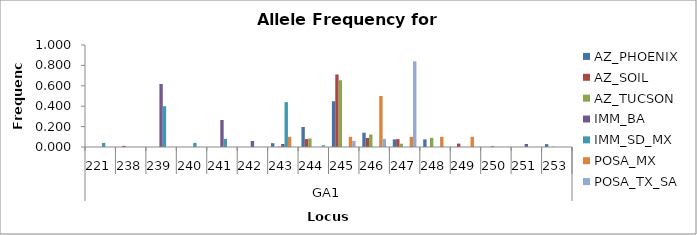
| Category | AZ_PHOENIX | AZ_SOIL | AZ_TUCSON | IMM_BA | IMM_SD_MX | POSA_MX | POSA_TX_SA |
|---|---|---|---|---|---|---|---|
| 0 | 0 | 0 | 0 | 0 | 0.04 | 0 | 0 |
| 1 | 0 | 0.011 | 0 | 0 | 0 | 0 | 0 |
| 2 | 0 | 0 | 0 | 0.618 | 0.4 | 0 | 0 |
| 3 | 0 | 0 | 0 | 0 | 0.04 | 0 | 0 |
| 4 | 0 | 0 | 0 | 0.265 | 0.08 | 0 | 0 |
| 5 | 0 | 0 | 0 | 0.059 | 0 | 0 | 0 |
| 6 | 0.037 | 0 | 0.004 | 0.029 | 0.44 | 0.1 | 0 |
| 7 | 0.196 | 0.078 | 0.083 | 0 | 0 | 0 | 0.02 |
| 8 | 0.449 | 0.711 | 0.655 | 0 | 0 | 0.1 | 0.06 |
| 9 | 0.14 | 0.089 | 0.122 | 0 | 0 | 0.5 | 0.08 |
| 10 | 0.075 | 0.078 | 0.032 | 0 | 0 | 0.1 | 0.84 |
| 11 | 0.075 | 0 | 0.09 | 0 | 0 | 0.1 | 0 |
| 12 | 0 | 0.033 | 0 | 0 | 0 | 0.1 | 0 |
| 13 | 0 | 0 | 0.011 | 0 | 0 | 0 | 0 |
| 14 | 0 | 0 | 0 | 0.029 | 0 | 0 | 0 |
| 15 | 0.028 | 0 | 0.004 | 0 | 0 | 0 | 0 |